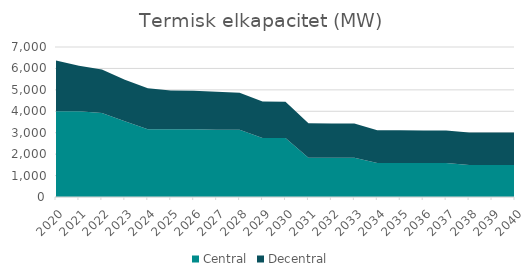
| Category | Central | Decentral |
|---|---|---|
| 2020.0 | 4004.6 | 2363.26 |
| 2021.0 | 4004.6 | 2115.294 |
| 2022.0 | 3922.6 | 2025.909 |
| 2023.0 | 3537.6 | 1935.715 |
| 2024.0 | 3164.3 | 1909.06 |
| 2025.0 | 3164.3 | 1805.818 |
| 2026.0 | 3164.3 | 1794.068 |
| 2027.0 | 3141.1 | 1775.158 |
| 2028.0 | 3141.1 | 1729.119 |
| 2029.0 | 2756.1 | 1704.015 |
| 2030.0 | 2756.1 | 1688.324 |
| 2031.0 | 1833.1 | 1604.344 |
| 2032.0 | 1833.1 | 1599.45 |
| 2033.0 | 1833.1 | 1593.046 |
| 2034.0 | 1583.1 | 1530.491 |
| 2035.0 | 1583.1 | 1528.542 |
| 2036.0 | 1583.1 | 1522.483 |
| 2037.0 | 1583.1 | 1519.616 |
| 2038.0 | 1493.1 | 1516.749 |
| 2039.0 | 1493.1 | 1515.343 |
| 2040.0 | 1493.1 | 1515.343 |